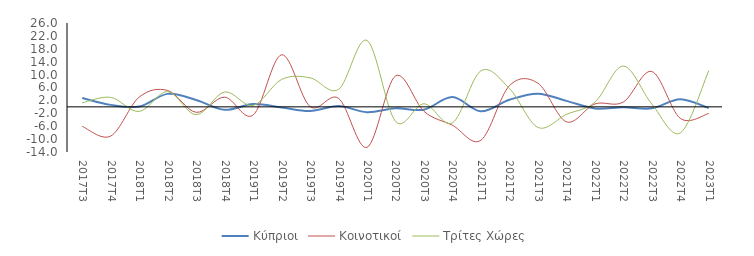
| Category | Κύπριοι | Κοινοτικοί | Τρίτες Χώρες |
|---|---|---|---|
| 2017Τ3 | 2.76 | -6.051 | 1.245 |
| 2017Τ4 | 0.611 | -9.065 | 2.94 |
| 2018Τ1 | 0.102 | 3.027 | -1.426 |
| 2018Τ2 | 4.023 | 5.079 | 4.742 |
| 2018Τ3 | 2.13 | -1.698 | -2.439 |
| 2018Τ4 | -0.92 | 3.002 | 4.61 |
| 2019Τ1 | 0.847 | -2.551 | 0.424 |
| 2019Τ2 | -0.212 | 16.147 | 8.492 |
| 2019Τ3 | -1.307 | 0.095 | 9.007 |
| 2019Τ4 | 0.246 | 2.642 | 5.414 |
| 2020Τ1 | -1.648 | -12.551 | 20.599 |
| 2020Τ2 | -0.459 | 9.585 | -4.501 |
| 2020Τ3 | -0.868 | -1.397 | 0.948 |
| 2020Τ4 | 3.026 | -5.709 | -4.94 |
| 2021Τ1 | -1.383 | -10.349 | 11.181 |
| 2021Τ2 | 2.188 | 6.564 | 5.695 |
| 2021Τ3 | 4.07 | 7.34 | -6.362 |
| 2021Τ4 | 1.853 | -4.645 | -2.354 |
| 2022Τ1 | -0.481 | 0.899 | 1.427 |
| 2022Τ2 | -0.126 | 1.492 | 12.634 |
| 2022Τ3 | -0.463 | 10.962 | 0.885 |
| 2022Τ4 | 2.39 | -3.557 | -8.097 |
| 2023Τ1 | -0.362 | -2.064 | 11.229 |